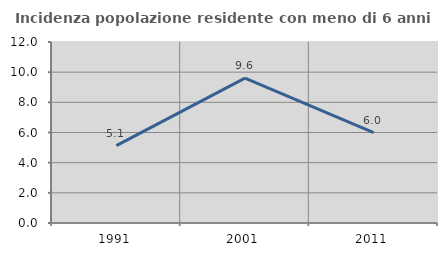
| Category | Incidenza popolazione residente con meno di 6 anni |
|---|---|
| 1991.0 | 5.128 |
| 2001.0 | 9.606 |
| 2011.0 | 5.988 |